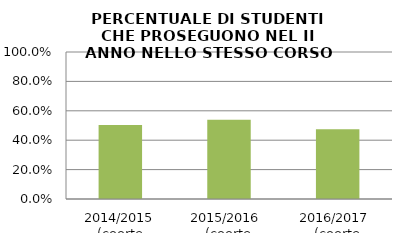
| Category | 2014/2015 (coorte 2013/14) 2015/2016  (coorte 2014/15) 2016/2017  (coorte 2015/16) |
|---|---|
| 2014/2015 (coorte 2013/14) | 0.503 |
| 2015/2016  (coorte 2014/15) | 0.539 |
| 2016/2017  (coorte 2015/16) | 0.474 |